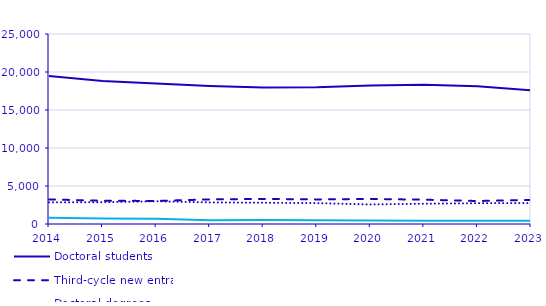
| Category | Doctoral students | Third-cycle new entrants | Doctoral degrees | Licentiate degrees |
|---|---|---|---|---|
| 2014.0 | 19462 | 3236 | 2851 | 838 |
| 2015.0 | 18818 | 3058 | 2863 | 736 |
| 2016.0 | 18471 | 3033 | 2991 | 689 |
| 2017.0 | 18153 | 3236 | 2840 | 503 |
| 2018.0 | 17963 | 3303 | 2800 | 518 |
| 2019.0 | 18002 | 3234 | 2748 | 481 |
| 2020.0 | 18211 | 3299 | 2570 | 448 |
| 2021.0 | 18316 | 3199 | 2668 | 436 |
| 2022.0 | 18127 | 3025 | 2735 | 427 |
| 2023.0 | 17595 | 3170 | 2758 | 415 |